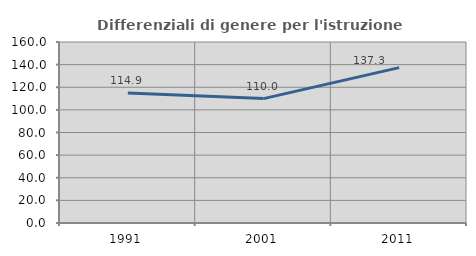
| Category | Differenziali di genere per l'istruzione superiore |
|---|---|
| 1991.0 | 114.948 |
| 2001.0 | 109.955 |
| 2011.0 | 137.325 |